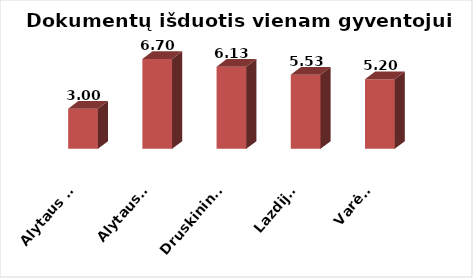
| Category | Series 0 |
|---|---|
| Alytaus m. | 2.998 |
| Alytaus r. | 6.702 |
| Druskininkai | 6.131 |
| Lazdijai | 5.534 |
| Varėna | 5.201 |